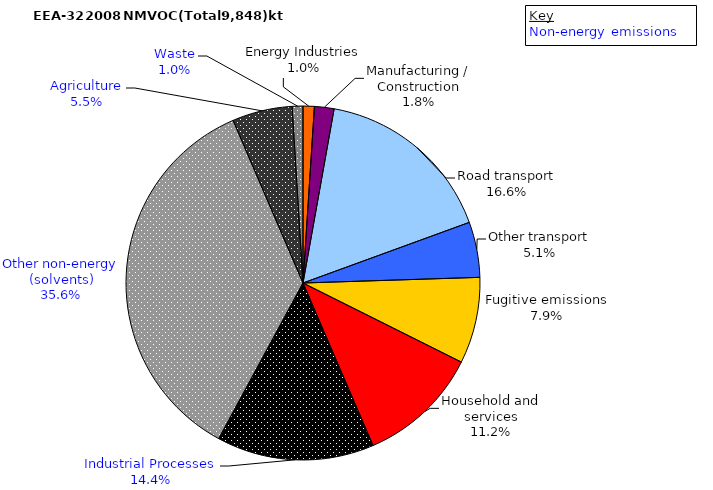
| Category | Series 0 |
|---|---|
| Energy Industries | 101.194 |
| Manufacturing / Construction | 176.065 |
| Road transport | 1636.015 |
| Other transport | 497.673 |
| Fugitive emissions | 775.928 |
| Household and services | 1097.669 |
| Industrial Processes | 1415.008 |
| Other non-energy (solvents) | 3508.35 |
| Agriculture | 539.604 |
| Waste | 96.684 |